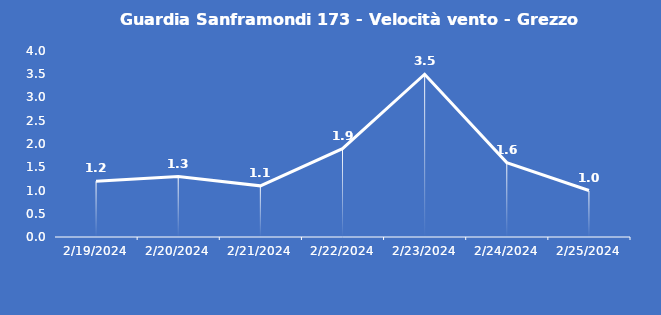
| Category | Guardia Sanframondi 173 - Velocità vento - Grezzo (m/s) |
|---|---|
| 2/19/24 | 1.2 |
| 2/20/24 | 1.3 |
| 2/21/24 | 1.1 |
| 2/22/24 | 1.9 |
| 2/23/24 | 3.5 |
| 2/24/24 | 1.6 |
| 2/25/24 | 1 |